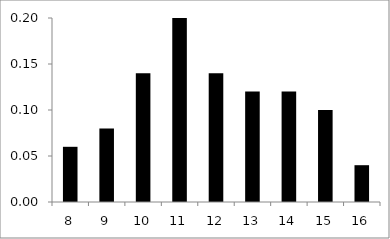
| Category | Series 0 |
|---|---|
| 8.0 | 0.06 |
| 9.0 | 0.08 |
| 10.0 | 0.14 |
| 11.0 | 0.2 |
| 12.0 | 0.14 |
| 13.0 | 0.12 |
| 14.0 | 0.12 |
| 15.0 | 0.1 |
| 16.0 | 0.04 |